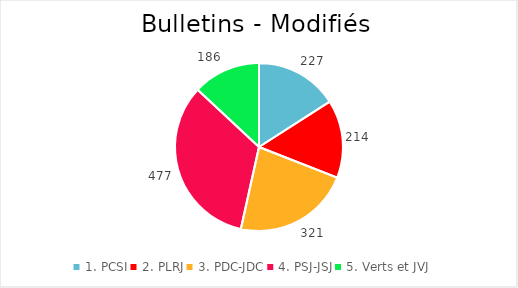
| Category | Series 0 |
|---|---|
| 1. PCSI | 227 |
| 2. PLRJ | 214 |
| 3. PDC-JDC | 321 |
| 4. PSJ-JSJ | 477 |
| 5. Verts et JVJ | 186 |